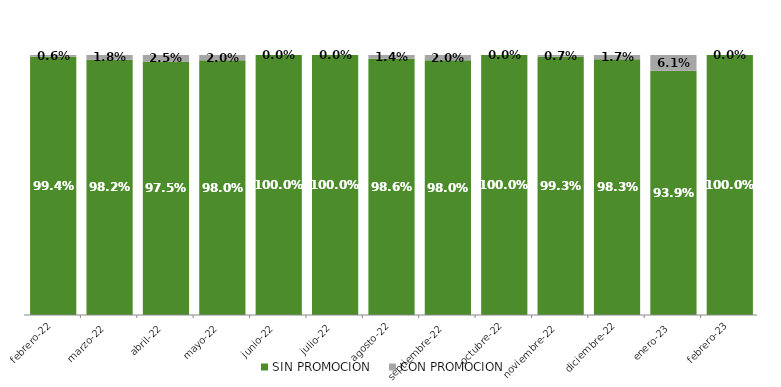
| Category | SIN PROMOCION   | CON PROMOCION   |
|---|---|---|
| 2022-02-01 | 0.994 | 0.006 |
| 2022-03-01 | 0.982 | 0.018 |
| 2022-04-01 | 0.975 | 0.025 |
| 2022-05-01 | 0.98 | 0.02 |
| 2022-06-01 | 1 | 0 |
| 2022-07-01 | 1 | 0 |
| 2022-08-01 | 0.986 | 0.014 |
| 2022-09-01 | 0.98 | 0.02 |
| 2022-10-01 | 1 | 0 |
| 2022-11-01 | 0.993 | 0.007 |
| 2022-12-01 | 0.983 | 0.017 |
| 2023-01-01 | 0.939 | 0.061 |
| 2023-02-01 | 1 | 0 |